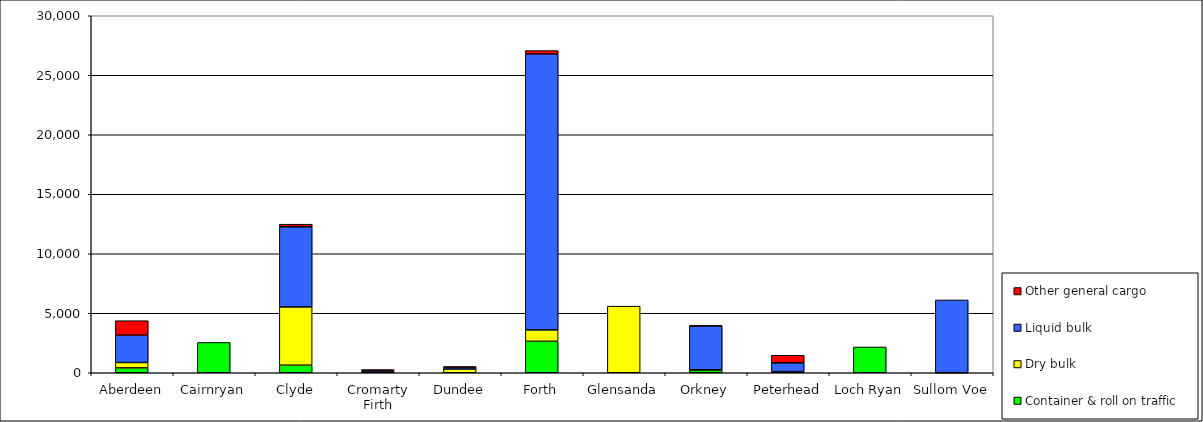
| Category | Container & roll on traffic | Dry bulk | Liquid bulk | Other general cargo |
|---|---|---|---|---|
| Aberdeen | 408 | 455 | 2298 | 1215 |
| Cairnryan | 2548 | 0 | 0 | 0 |
| Clyde | 634 | 4899 | 6729 | 223 |
| Cromarty Firth | 0 | 109 | 89 | 64 |
| Dundee | 0 | 310 | 157 | 48 |
| Forth | 2643 | 958 | 23183 | 290 |
| Glensanda | 0 | 5597 | 0 | 0 |
| Orkney | 234 | 16 | 3688 | 7 |
| Peterhead | 0 | 97 | 735 | 635 |
| Loch Ryan | 2163 | 0 | 0 | 0 |
| Sullom Voe | 0 | 5 | 6114 | 0 |